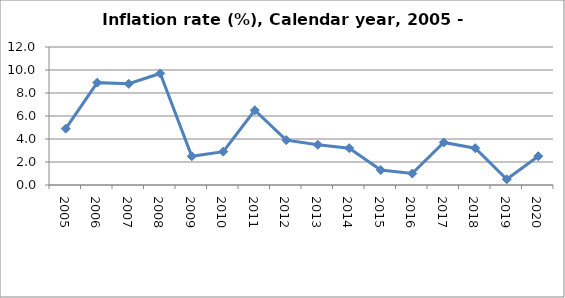
| Category | Inflation rate |
|---|---|
| 2005 | 4.9 |
| 2006 | 8.9 |
| 2007 | 8.8 |
| 2008 | 9.7 |
| 2009 | 2.5 |
| 2010 | 2.9 |
| 2011 | 6.5 |
| 2012 | 3.9 |
| 2013 | 3.5 |
| 2014 | 3.2 |
| 2015 | 1.3 |
| 2016 | 1 |
| 2017 | 3.7 |
| 2018 | 3.2 |
| 2019 | 0.5 |
| 2020 | 2.5 |